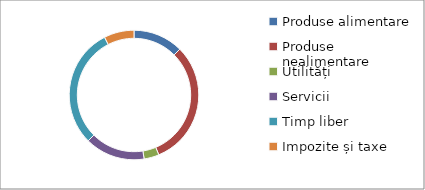
| Category | Series 0 | Series 1 | Series 2 | Series 3 |
|---|---|---|---|---|
| Produse alimentare | 0 |  |  | 0.125 |
| Produse nealimentare | 0 |  |  | 0.312 |
| Utilități | 0 |  |  | 0.037 |
| Servicii | 0 |  |  | 0.15 |
| Timp liber | 0 |  |  | 0.3 |
| Impozite și taxe | 0 |  |  | 0.075 |